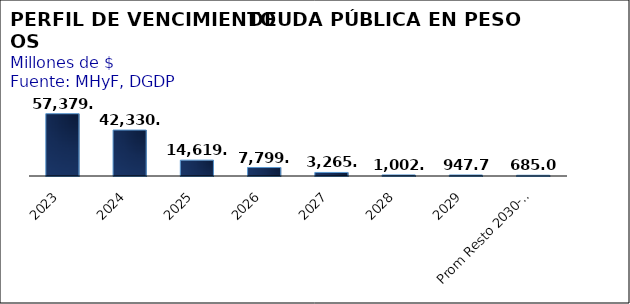
| Category | Series 0 |
|---|---|
| 2023 | 57379.118 |
| 2024 | 42330.872 |
| 2025 | 14619.239 |
| 2026 | 7799.247 |
| 2027 | 3265.462 |
| 2028 | 1002.127 |
| 2029 | 947.726 |
| Prom Resto 2030-2050 | 685.028 |